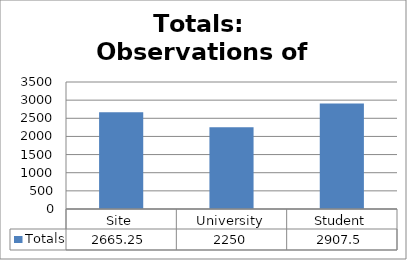
| Category | Totals |
|---|---|
| Site | 2665.25 |
| University | 2250 |
| Student | 2907.5 |